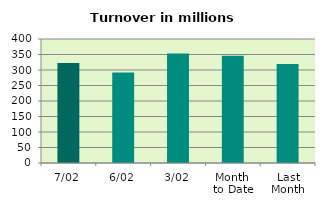
| Category | Series 0 |
|---|---|
| 7/02 | 322.229 |
| 6/02 | 291.77 |
| 3/02 | 353.374 |
| Month 
to Date | 345.946 |
| Last
Month | 318.977 |